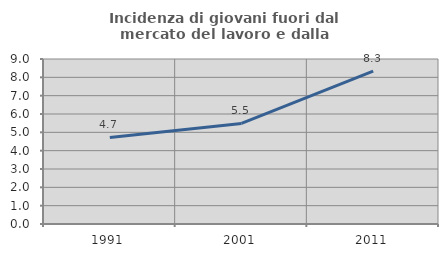
| Category | Incidenza di giovani fuori dal mercato del lavoro e dalla formazione  |
|---|---|
| 1991.0 | 4.722 |
| 2001.0 | 5.486 |
| 2011.0 | 8.333 |